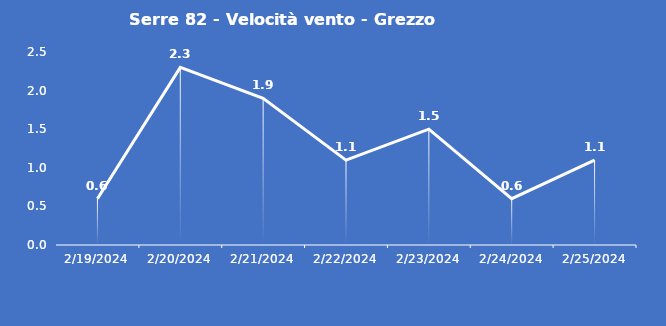
| Category | Serre 82 - Velocità vento - Grezzo (m/s) |
|---|---|
| 2/19/24 | 0.6 |
| 2/20/24 | 2.3 |
| 2/21/24 | 1.9 |
| 2/22/24 | 1.1 |
| 2/23/24 | 1.5 |
| 2/24/24 | 0.6 |
| 2/25/24 | 1.1 |